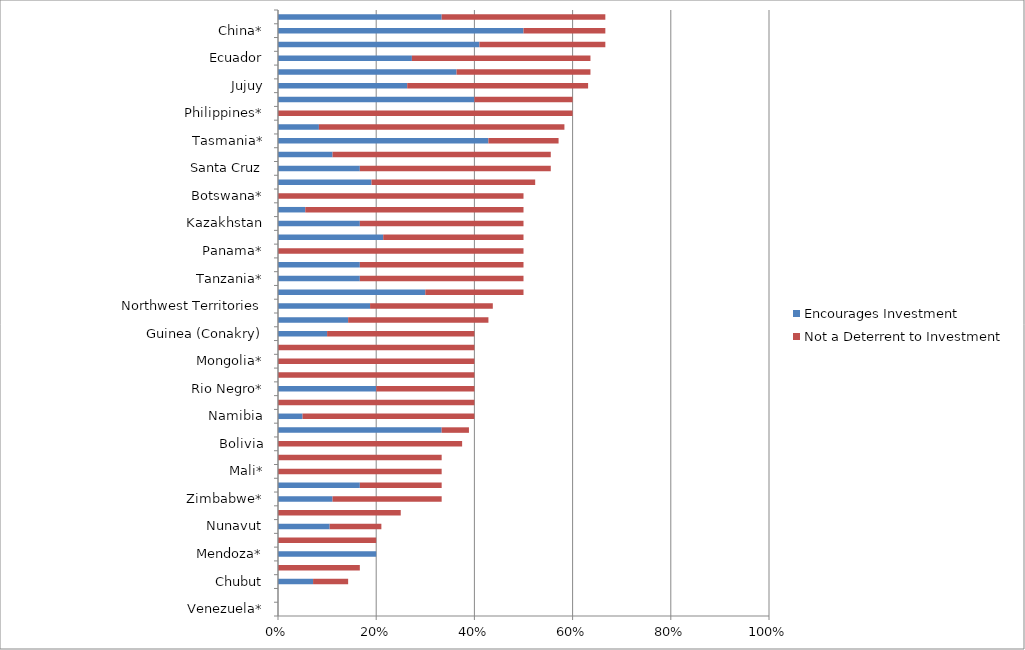
| Category | Encourages Investment | Not a Deterrent to Investment |
|---|---|---|
| Venezuela* | 0 | 0 |
| Nicaragua* | 0 | 0 |
| Chubut | 0.071 | 0.071 |
| Guyana* | 0 | 0.167 |
| Mendoza* | 0.2 | 0 |
| Democratic Republic of Congo (DRC)* | 0 | 0.2 |
| Nunavut | 0.105 | 0.105 |
| Papua New Guinea | 0 | 0.25 |
| Zimbabwe* | 0.111 | 0.222 |
| Niger* | 0.167 | 0.167 |
| Mali* | 0 | 0.333 |
| Greenland* | 0 | 0.333 |
| Bolivia | 0 | 0.375 |
| La Rioja | 0.333 | 0.056 |
| Namibia | 0.05 | 0.35 |
| Spain* | 0 | 0.4 |
| Rio Negro* | 0.2 | 0.2 |
| New Zealand* | 0 | 0.4 |
| Mongolia* | 0 | 0.4 |
| Liberia* | 0 | 0.4 |
| Guinea (Conakry) | 0.1 | 0.3 |
| Mauritania* | 0.143 | 0.286 |
| Northwest Territories | 0.188 | 0.25 |
| Turkey | 0.3 | 0.2 |
| Tanzania* | 0.167 | 0.333 |
| Senegal* | 0.167 | 0.333 |
| Panama* | 0 | 0.5 |
| Northern Territory | 0.214 | 0.286 |
| Kazakhstan | 0.167 | 0.333 |
| Catamarca | 0.056 | 0.444 |
| Botswana* | 0 | 0.5 |
| Brazil | 0.19 | 0.333 |
| Santa Cruz | 0.167 | 0.389 |
| Burkina Faso* | 0.111 | 0.444 |
| Tasmania* | 0.429 | 0.143 |
| Indonesia | 0.083 | 0.5 |
| Philippines* | 0 | 0.6 |
| Kyrgyzstan* | 0.4 | 0.2 |
| Jujuy | 0.263 | 0.368 |
| Victoria | 0.364 | 0.273 |
| Ecuador | 0.273 | 0.364 |
| Western Australia | 0.41 | 0.256 |
| China* | 0.5 | 0.167 |
| California | 0.333 | 0.333 |